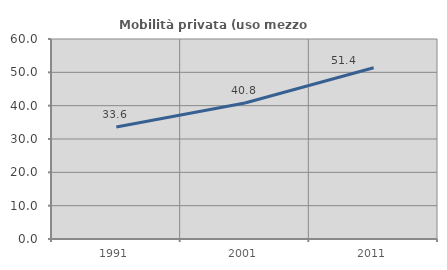
| Category | Mobilità privata (uso mezzo privato) |
|---|---|
| 1991.0 | 33.575 |
| 2001.0 | 40.792 |
| 2011.0 | 51.368 |